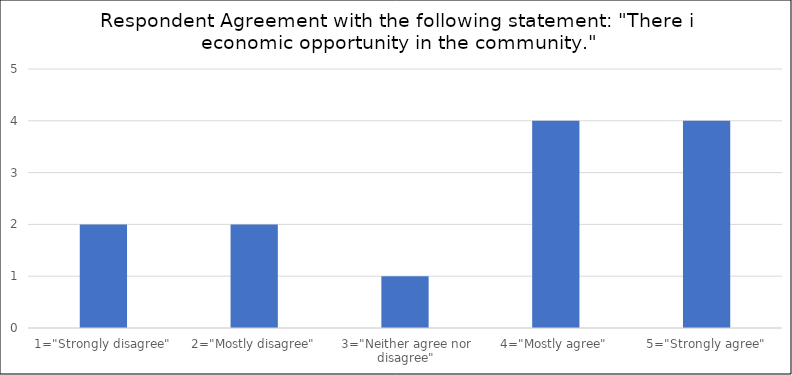
| Category | Number of Responses |
|---|---|
| 1="Strongly disagree" | 2 |
| 2="Mostly disagree" | 2 |
| 3="Neither agree nor disagree" | 1 |
| 4="Mostly agree" | 4 |
| 5="Strongly agree" | 4 |